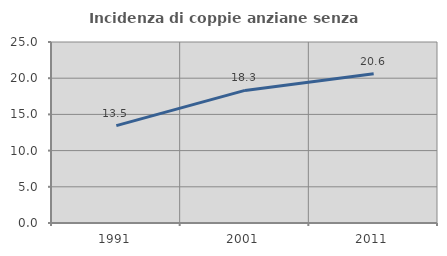
| Category | Incidenza di coppie anziane senza figli  |
|---|---|
| 1991.0 | 13.45 |
| 2001.0 | 18.316 |
| 2011.0 | 20.616 |